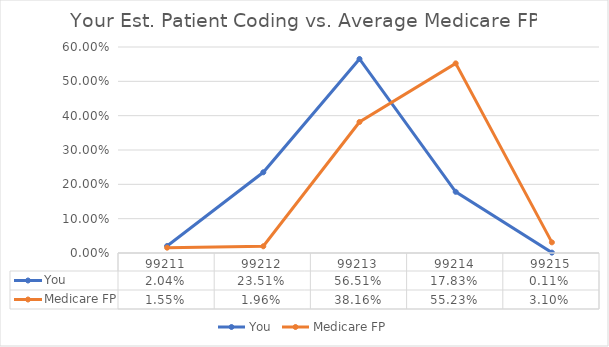
| Category | You | Medicare FP |
|---|---|---|
| 99211.0 | 0.02 | 0.016 |
| 99212.0 | 0.235 | 0.02 |
| 99213.0 | 0.565 | 0.382 |
| 99214.0 | 0.178 | 0.552 |
| 99215.0 | 0.001 | 0.031 |